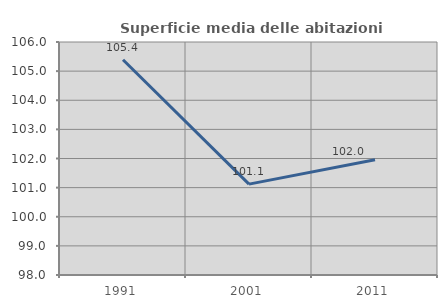
| Category | Superficie media delle abitazioni occupate |
|---|---|
| 1991.0 | 105.391 |
| 2001.0 | 101.121 |
| 2011.0 | 101.959 |